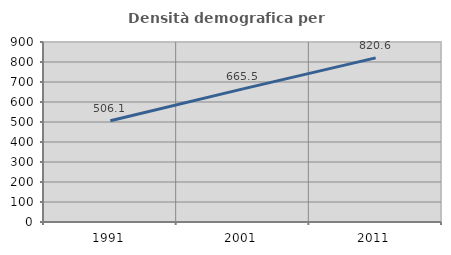
| Category | Densità demografica |
|---|---|
| 1991.0 | 506.104 |
| 2001.0 | 665.495 |
| 2011.0 | 820.64 |